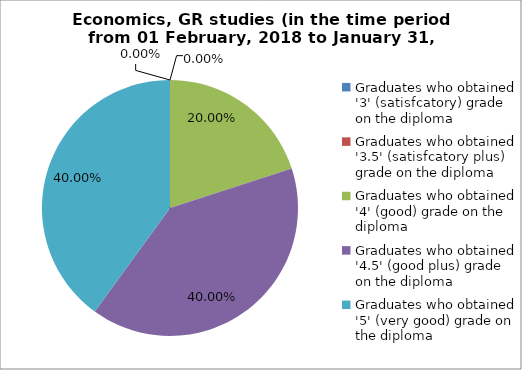
| Category | Series 0 |
|---|---|
| Graduates who obtained '3' (satisfcatory) grade on the diploma  | 0 |
| Graduates who obtained '3.5' (satisfcatory plus) grade on the diploma  | 0 |
| Graduates who obtained '4' (good) grade on the diploma  | 20 |
| Graduates who obtained '4.5' (good plus) grade on the diploma  | 40 |
| Graduates who obtained '5' (very good) grade on the diploma  | 40 |